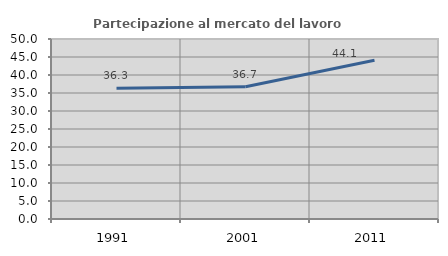
| Category | Partecipazione al mercato del lavoro  femminile |
|---|---|
| 1991.0 | 36.291 |
| 2001.0 | 36.73 |
| 2011.0 | 44.073 |